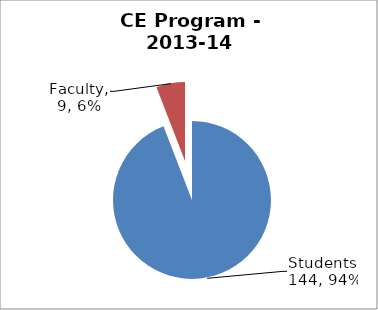
| Category | Series 0 |
|---|---|
| Students | 144 |
| Faculty | 9 |